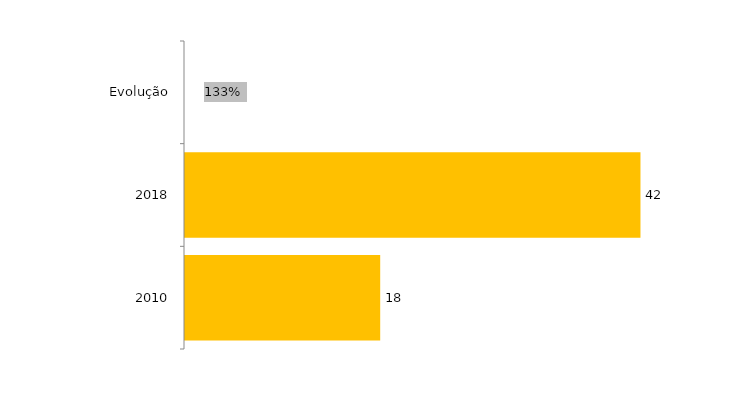
| Category | Evolução Vagas Ofertadas |
|---|---|
| 2010 | 18 |
| 2018 | 42 |
| Evolução | 1.333 |